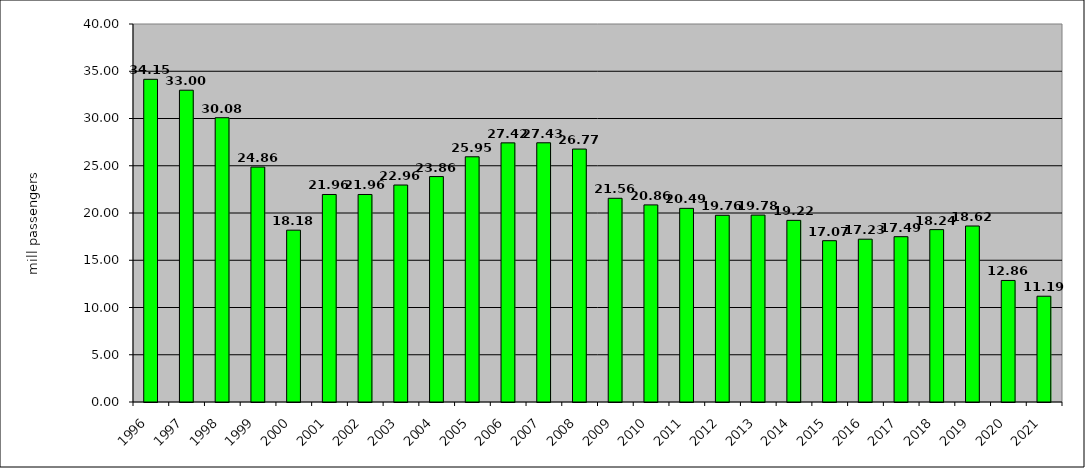
| Category | Series 0 |
|---|---|
| 1996.0 | 34.147 |
| 1997.0 | 32.995 |
| 1998.0 | 30.084 |
| 1999.0 | 24.861 |
| 2000.0 | 18.184 |
| 2001.0 | 21.959 |
| 2002.0 | 21.959 |
| 2003.0 | 22.96 |
| 2004.0 | 23.855 |
| 2005.0 | 25.948 |
| 2006.0 | 27.421 |
| 2007.0 | 27.43 |
| 2008.0 | 26.767 |
| 2009.0 | 21.556 |
| 2010.0 | 20.857 |
| 2011.0 | 20.492 |
| 2012.0 | 19.757 |
| 2013.0 | 19.78 |
| 2014.0 | 19.222 |
| 2015.0 | 17.07 |
| 2016.0 | 17.228 |
| 2017.0 | 17.493 |
| 2018.0 | 18.241 |
| 2019.0 | 18.624 |
| 2020.0 | 12.862 |
| 2021.0 | 11.193 |